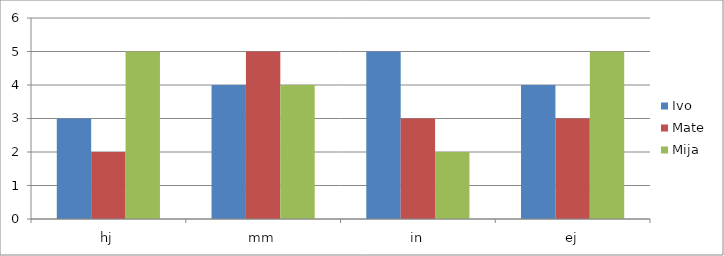
| Category | Ivo | Mate | Mija |
|---|---|---|---|
| hj | 3 | 2 | 5 |
| mm | 4 | 5 | 4 |
| in | 5 | 3 | 2 |
| ej | 4 | 3 | 5 |